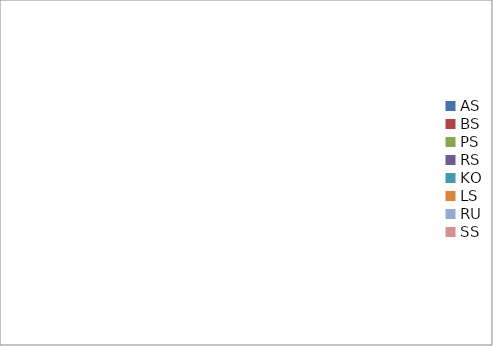
| Category | Series 0 |
|---|---|
| AS | 0 |
| BS | 0 |
| PS | 0 |
| RS | 0 |
| KO | 0 |
| LS | 0 |
| RU | 0 |
| SS | 0 |